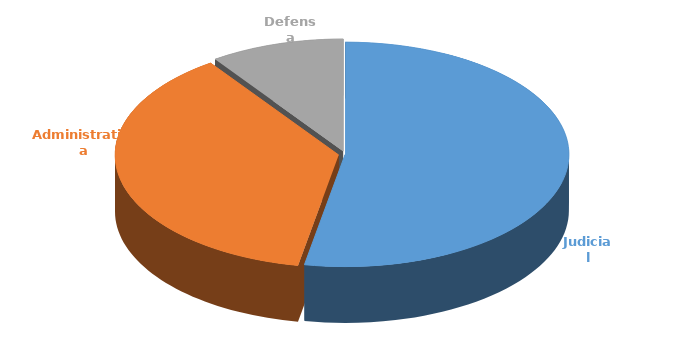
| Category | Cantidad |
|---|---|
| Judicial | 327 |
| Administrativa | 231 |
| Defensa | 60 |